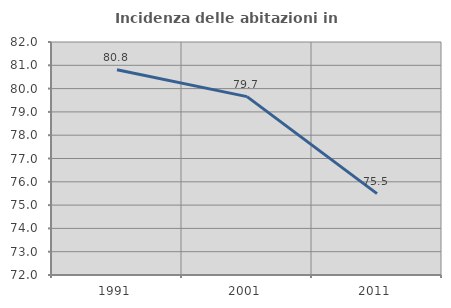
| Category | Incidenza delle abitazioni in proprietà  |
|---|---|
| 1991.0 | 80.808 |
| 2001.0 | 79.656 |
| 2011.0 | 75.493 |